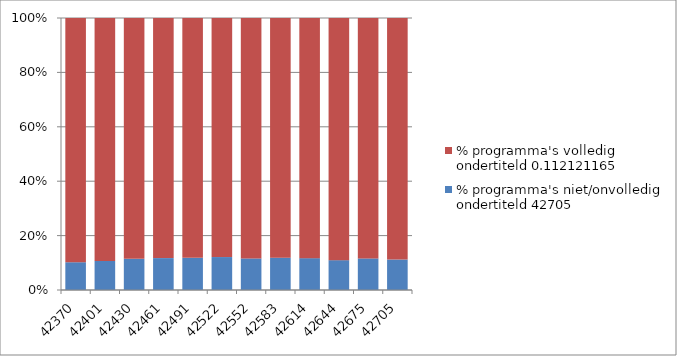
| Category | % programma's niet/onvolledig ondertiteld 42705 | % programma's volledig ondertiteld 0,112121165 |
|---|---|---|
| 42370.0 | 0.102 | 0.898 |
| 42401.0 | 0.107 | 0.893 |
| 42430.0 | 0.115 | 0.885 |
| 42461.0 | 0.117 | 0.883 |
| 42491.0 | 0.118 | 0.882 |
| 42522.0 | 0.121 | 0.879 |
| 42552.0 | 0.116 | 0.884 |
| 42583.0 | 0.119 | 0.881 |
| 42614.0 | 0.117 | 0.883 |
| 42644.0 | 0.11 | 0.89 |
| 42675.0 | 0.116 | 0.884 |
| 42705.0 | 0.112 | 0.888 |